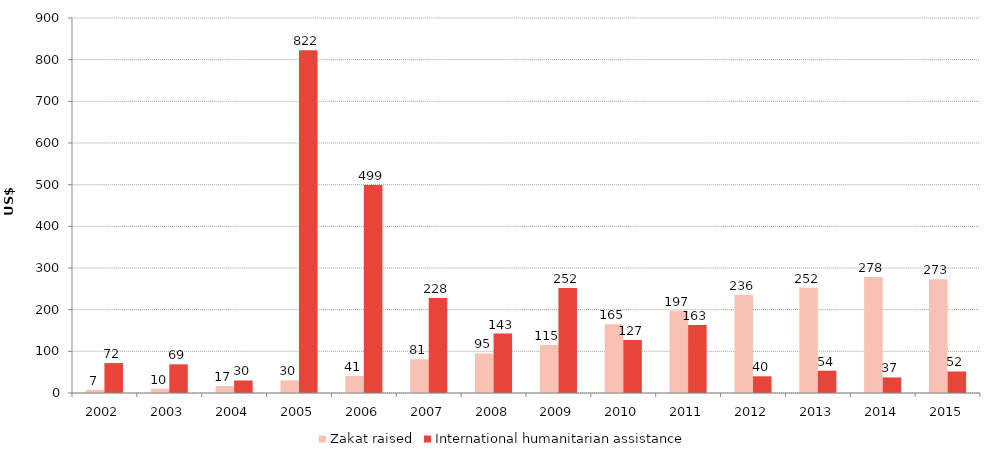
| Category | Zakat raised | International humanitarian assistance |
|---|---|---|
| 2002.0 | 7.345 | 71.839 |
| 2003.0 | 9.943 | 68.726 |
| 2004.0 | 16.791 | 30.024 |
| 2005.0 | 30.451 | 822.395 |
| 2006.0 | 40.742 | 499.336 |
| 2007.0 | 80.954 | 228.082 |
| 2008.0 | 94.856 | 142.537 |
| 2009.0 | 115.496 | 251.888 |
| 2010.0 | 165.027 | 126.949 |
| 2011.0 | 197.124 | 163.445 |
| 2012.0 | 235.697 | 40.066 |
| 2013.0 | 252.322 | 53.558 |
| 2014.0 | 278.124 | 37.391 |
| 2015.0 | 272.848 | 51.691 |